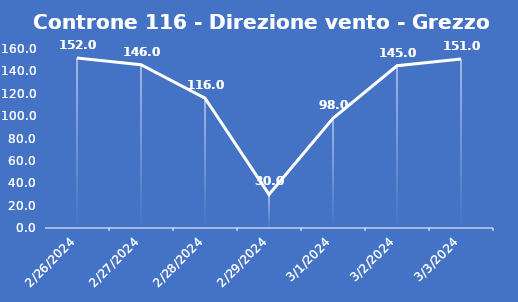
| Category | Controne 116 - Direzione vento - Grezzo (°N) |
|---|---|
| 2/26/24 | 152 |
| 2/27/24 | 146 |
| 2/28/24 | 116 |
| 2/29/24 | 30 |
| 3/1/24 | 98 |
| 3/2/24 | 145 |
| 3/3/24 | 151 |